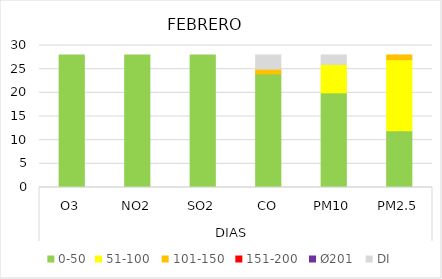
| Category | 0-50 | 51-100  | 101-150  | 151-200  | Ø201  | DI |
|---|---|---|---|---|---|---|
| 0 | 28 | 0 | 0 | 0 | 0 | 0 |
| 1 | 28 | 0 | 0 | 0 | 0 | 0 |
| 2 | 28 | 0 | 0 | 0 | 0 | 0 |
| 3 | 24 | 0 | 1 | 0 | 0 | 3 |
| 4 | 20 | 6 | 0 | 0 | 0 | 2 |
| 5 | 12 | 15 | 1 | 0 | 0 | 0 |